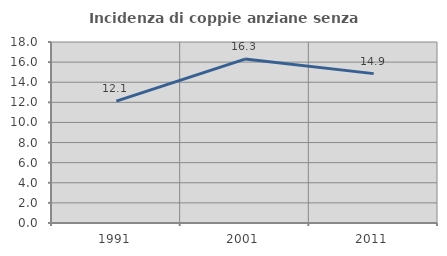
| Category | Incidenza di coppie anziane senza figli  |
|---|---|
| 1991.0 | 12.115 |
| 2001.0 | 16.3 |
| 2011.0 | 14.856 |